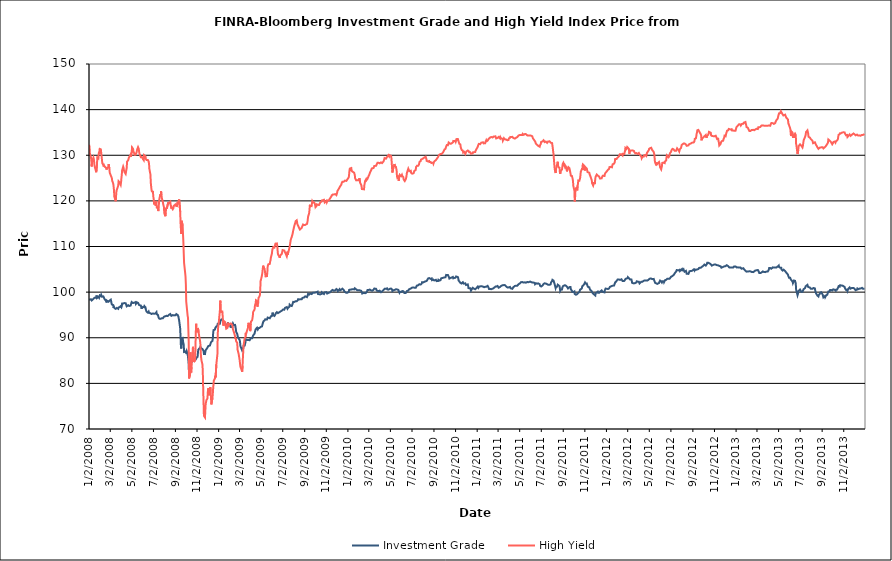
| Category | Investment Grade | High Yield |
|---|---|---|
| 1/2/08 | 98.337 | 132.293 |
| 1/3/08 | 98.358 | 131.799 |
| 1/4/08 | 98.524 | 130.434 |
| 1/7/08 | 98.436 | 129.561 |
| 1/8/08 | 98.305 | 128.956 |
| 1/9/08 | 98.174 | 127.53 |
| 1/10/08 | 98.058 | 128.298 |
| 1/11/08 | 98.376 | 128.78 |
| 1/14/08 | 98.517 | 129.494 |
| 1/15/08 | 98.694 | 129.211 |
| 1/16/08 | 98.695 | 128.559 |
| 1/17/08 | 98.751 | 127.724 |
| 1/18/08 | 98.633 | 127.936 |
| 1/22/08 | 98.77 | 126.27 |
| 1/23/08 | 99.273 | 126.228 |
| 1/24/08 | 98.707 | 127.975 |
| 1/25/08 | 98.86 | 129.489 |
| 1/28/08 | 98.969 | 129.313 |
| 1/29/08 | 98.823 | 130.425 |
| 1/30/08 | 98.743 | 130.71 |
| 1/31/08 | 99.005 | 130.356 |
| 2/1/08 | 99.286 | 131.379 |
| 2/4/08 | 99.139 | 131.284 |
| 2/5/08 | 99.394 | 130.53 |
| 2/6/08 | 99.316 | 129.842 |
| 2/7/08 | 98.995 | 129.054 |
| 2/8/08 | 98.938 | 128.292 |
| 2/11/08 | 99.055 | 127.834 |
| 2/12/08 | 98.842 | 127.526 |
| 2/13/08 | 98.759 | 127.812 |
| 2/14/08 | 98.506 | 128.015 |
| 2/15/08 | 98.48 | 127.496 |
| 2/19/08 | 98.065 | 127.216 |
| 2/20/08 | 97.734 | 126.86 |
| 2/21/08 | 98.151 | 127.118 |
| 2/22/08 | 98.308 | 127.087 |
| 2/25/08 | 97.881 | 127.442 |
| 2/26/08 | 97.785 | 128.038 |
| 2/27/08 | 97.922 | 127.971 |
| 2/28/08 | 98.104 | 127.117 |
| 2/29/08 | 98.304 | 126.172 |
| 3/3/08 | 98.352 | 125.588 |
| 3/4/08 | 98.01 | 125.372 |
| 3/5/08 | 97.579 | 125.599 |
| 3/6/08 | 97.296 | 124.984 |
| 3/7/08 | 97.268 | 124.421 |
| 3/10/08 | 97.154 | 123.76 |
| 3/11/08 | 96.527 | 123.134 |
| 3/12/08 | 96.766 | 122.372 |
| 3/13/08 | 96.631 | 120.939 |
| 3/14/08 | 96.461 | 120.942 |
| 3/17/08 | 96.334 | 119.921 |
| 3/18/08 | 96.297 | 121.114 |
| 3/19/08 | 96.436 | 122.177 |
| 3/20/08 | 96.528 | 122.053 |
| 3/24/08 | 96.345 | 123.33 |
| 3/25/08 | 96.627 | 124.299 |
| 3/26/08 | 96.718 | 124.484 |
| 3/27/08 | 96.626 | 124.415 |
| 3/28/08 | 96.725 | 124.025 |
| 3/31/08 | 96.93 | 123.51 |
| 4/1/08 | 96.733 | 124.086 |
| 4/2/08 | 96.681 | 124.971 |
| 4/3/08 | 96.904 | 125.651 |
| 4/4/08 | 97.511 | 126.698 |
| 4/7/08 | 97.51 | 127.501 |
| 4/8/08 | 97.52 | 127.264 |
| 4/9/08 | 97.663 | 126.784 |
| 4/10/08 | 97.601 | 126.514 |
| 4/11/08 | 97.682 | 126.279 |
| 4/14/08 | 97.563 | 125.906 |
| 4/15/08 | 97.328 | 126.02 |
| 4/16/08 | 97.135 | 126.838 |
| 4/17/08 | 96.893 | 127.234 |
| 4/18/08 | 96.825 | 128.596 |
| 4/21/08 | 97.135 | 128.905 |
| 4/22/08 | 97.274 | 129.136 |
| 4/23/08 | 97.26 | 129.434 |
| 4/24/08 | 96.953 | 129.446 |
| 4/25/08 | 96.919 | 129.6 |
| 4/28/08 | 97.06 | 130.166 |
| 4/29/08 | 97.332 | 129.693 |
| 4/30/08 | 97.527 | 130.093 |
| 5/1/08 | 97.824 | 130.518 |
| 5/2/08 | 97.661 | 131.72 |
| 5/5/08 | 97.608 | 131.372 |
| 5/6/08 | 97.515 | 130.782 |
| 5/7/08 | 97.444 | 130.624 |
| 5/8/08 | 97.675 | 130.508 |
| 5/9/08 | 97.876 | 130.119 |
| 5/12/08 | 97.82 | 130.1 |
| 5/13/08 | 97.428 | 130.119 |
| 5/14/08 | 97.243 | 130.183 |
| 5/15/08 | 97.393 | 130.66 |
| 5/16/08 | 97.747 | 131.142 |
| 5/19/08 | 97.633 | 131.778 |
| 5/20/08 | 97.729 | 131.603 |
| 5/21/08 | 97.645 | 131.401 |
| 5/22/08 | 97.16 | 130.774 |
| 5/23/08 | 97.326 | 130.321 |
| 5/27/08 | 97.058 | 129.562 |
| 5/28/08 | 96.717 | 129.577 |
| 5/29/08 | 96.344 | 129.674 |
| 5/30/08 | 96.618 | 129.614 |
| 6/2/08 | 96.776 | 129.144 |
| 6/3/08 | 96.823 | 128.928 |
| 6/4/08 | 96.966 | 128.918 |
| 6/5/08 | 96.689 | 130.034 |
| 6/6/08 | 96.934 | 129.935 |
| 6/9/08 | 96.667 | 129.754 |
| 6/10/08 | 96.181 | 129.199 |
| 6/11/08 | 96.106 | 129.031 |
| 6/12/08 | 95.726 | 128.947 |
| 6/13/08 | 95.637 | 128.871 |
| 6/16/08 | 95.49 | 128.941 |
| 6/17/08 | 95.599 | 129.027 |
| 6/18/08 | 95.735 | 128.631 |
| 6/19/08 | 95.5 | 128.104 |
| 6/20/08 | 95.542 | 126.99 |
| 6/23/08 | 95.361 | 125.756 |
| 6/24/08 | 95.322 | 123.938 |
| 6/25/08 | 95.234 | 123.849 |
| 6/26/08 | 95.211 | 122.417 |
| 6/27/08 | 95.37 | 122.083 |
| 6/30/08 | 95.326 | 122.015 |
| 7/1/08 | 95.242 | 120.994 |
| 7/2/08 | 95.291 | 120.494 |
| 7/3/08 | 95.268 | 119.376 |
| 7/7/08 | 95.303 | 119.338 |
| 7/8/08 | 95.38 | 118.894 |
| 7/9/08 | 95.507 | 119.988 |
| 7/10/08 | 95.61 | 119.526 |
| 7/11/08 | 95.133 | 118.545 |
| 7/14/08 | 95.026 | 118.598 |
| 7/15/08 | 94.85 | 117.763 |
| 7/16/08 | 94.424 | 118.204 |
| 7/17/08 | 94.351 | 119.458 |
| 7/18/08 | 94.184 | 120.377 |
| 7/21/08 | 94.134 | 121.405 |
| 7/22/08 | 94.028 | 121.027 |
| 7/23/08 | 93.974 | 122.089 |
| 7/24/08 | 94.249 | 121.386 |
| 7/25/08 | 94.186 | 120.7 |
| 7/28/08 | 94.249 | 119.757 |
| 7/29/08 | 94.107 | 119.308 |
| 7/30/08 | 94.178 | 119.38 |
| 7/31/08 | 94.599 | 118.67 |
| 8/1/08 | 94.699 | 117.364 |
| 8/4/08 | 94.713 | 116.635 |
| 8/5/08 | 94.657 | 117.239 |
| 8/6/08 | 94.53 | 118.192 |
| 8/7/08 | 94.807 | 118.517 |
| 8/8/08 | 94.93 | 118.252 |
| 8/11/08 | 94.769 | 119.285 |
| 8/12/08 | 94.943 | 119.703 |
| 8/13/08 | 94.87 | 119.454 |
| 8/14/08 | 95.006 | 119.25 |
| 8/15/08 | 95.131 | 119.665 |
| 8/18/08 | 95.209 | 119.835 |
| 8/19/08 | 95.043 | 119.116 |
| 8/20/08 | 95.044 | 118.825 |
| 8/21/08 | 94.799 | 118.314 |
| 8/22/08 | 94.815 | 118.599 |
| 8/25/08 | 94.961 | 118.172 |
| 8/26/08 | 94.886 | 118.211 |
| 8/27/08 | 94.867 | 118.44 |
| 8/28/08 | 94.901 | 118.928 |
| 8/29/08 | 94.868 | 119 |
| 9/2/08 | 94.919 | 119.25 |
| 9/3/08 | 95.106 | 119.097 |
| 9/4/08 | 95.186 | 118.982 |
| 9/5/08 | 95.219 | 118.666 |
| 9/8/08 | 94.978 | 119.742 |
| 9/9/08 | 95.027 | 119.424 |
| 9/10/08 | 94.622 | 119.247 |
| 9/11/08 | 94.194 | 119.234 |
| 9/12/08 | 93.81 | 120.298 |
| 9/15/08 | 92.025 | 117.633 |
| 9/16/08 | 90.092 | 115.19 |
| 9/17/08 | 88.23 | 113.908 |
| 9/18/08 | 87.636 | 112.743 |
| 9/19/08 | 89.872 | 115.631 |
| 9/22/08 | 89.965 | 114.566 |
| 9/23/08 | 89.22 | 112.575 |
| 9/24/08 | 89.05 | 110.96 |
| 9/25/08 | 88.426 | 108.539 |
| 9/26/08 | 86.89 | 106.375 |
| 9/29/08 | 86.977 | 104.222 |
| 9/30/08 | 86.876 | 103.43 |
| 10/1/08 | 86.751 | 101.71 |
| 10/2/08 | 86.819 | 97.935 |
| 10/3/08 | 87.149 | 97.823 |
| 10/6/08 | 86.436 | 94.808 |
| 10/7/08 | 86.246 | 94.401 |
| 10/8/08 | 85.143 | 91.924 |
| 10/9/08 | 84.134 | 89.213 |
| 10/10/08 | 81.864 | 81.076 |
| 10/13/08 | 83.272 | 81.975 |
| 10/14/08 | 85.255 | 86.794 |
| 10/15/08 | 84.925 | 83.898 |
| 10/16/08 | 84.641 | 82.379 |
| 10/17/08 | 84.539 | 83.665 |
| 10/20/08 | 84.815 | 86.874 |
| 10/21/08 | 85.391 | 88.018 |
| 10/22/08 | 85.605 | 87.498 |
| 10/23/08 | 85.546 | 86.721 |
| 10/24/08 | 85.063 | 84.67 |
| 10/27/08 | 85.091 | 85.116 |
| 10/28/08 | 85.016 | 87.267 |
| 10/29/08 | 85.168 | 91.03 |
| 10/30/08 | 85.38 | 93.07 |
| 10/31/08 | 85.678 | 91.342 |
| 11/3/08 | 85.804 | 91.332 |
| 11/4/08 | 86.602 | 92.14 |
| 11/5/08 | 87.387 | 91.979 |
| 11/6/08 | 87.457 | 91.266 |
| 11/7/08 | 87.4 | 90.623 |
| 11/10/08 | 87.789 | 89.341 |
| 11/11/08 | 88.014 | 88.614 |
| 11/12/08 | 87.806 | 86.758 |
| 11/13/08 | 87.683 | 85.686 |
| 11/14/08 | 87.742 | 85.064 |
| 11/17/08 | 87.536 | 84.062 |
| 11/18/08 | 87.622 | 81.922 |
| 11/19/08 | 87.483 | 78.459 |
| 11/20/08 | 87.102 | 75.704 |
| 11/21/08 | 86.436 | 72.878 |
| 11/24/08 | 86.419 | 72.527 |
| 11/25/08 | 86.942 | 74.185 |
| 11/26/08 | 87.278 | 75.528 |
| 11/28/08 | 87.428 | 76.308 |
| 12/1/08 | 87.818 | 76.725 |
| 12/2/08 | 87.828 | 78.06 |
| 12/3/08 | 88.165 | 78.943 |
| 12/4/08 | 88.276 | 78.616 |
| 12/5/08 | 88.352 | 77.394 |
| 12/8/08 | 88.3 | 78.751 |
| 12/9/08 | 88.55 | 79.2 |
| 12/10/08 | 88.79 | 78.471 |
| 12/11/08 | 89.027 | 76.734 |
| 12/12/08 | 89 | 75.396 |
| 12/15/08 | 89.304 | 76.795 |
| 12/16/08 | 89.82 | 77.573 |
| 12/17/08 | 90.915 | 78.849 |
| 12/18/08 | 91.664 | 79.826 |
| 12/19/08 | 91.687 | 80.639 |
| 12/22/08 | 91.794 | 81.058 |
| 12/23/08 | 92.121 | 81.683 |
| 12/24/08 | 92.293 | 81.31 |
| 12/26/08 | 92.468 | 84.136 |
| 12/29/08 | 92.639 | 86.354 |
| 12/30/08 | 93.049 | 90.684 |
| 12/31/08 | 93.073 | 92.13 |
| 1/2/09 | 93.046 | 93.384 |
| 1/5/09 | 93.049 | 95.884 |
| 1/6/09 | 93.475 | 98.139 |
| 1/7/09 | 93.709 | 97.71 |
| 1/8/09 | 93.718 | 95.533 |
| 1/9/09 | 93.985 | 95.816 |
| 1/12/09 | 94.097 | 95.762 |
| 1/13/09 | 93.983 | 94.686 |
| 1/14/09 | 93.92 | 93.286 |
| 1/15/09 | 93.546 | 92.655 |
| 1/16/09 | 93.671 | 93.669 |
| 1/20/09 | 93.14 | 93.418 |
| 1/21/09 | 92.925 | 93.023 |
| 1/22/09 | 92.583 | 92.395 |
| 1/23/09 | 92.491 | 91.995 |
| 1/26/09 | 92.535 | 92.134 |
| 1/27/09 | 92.931 | 92.144 |
| 1/28/09 | 93.364 | 93.304 |
| 1/29/09 | 93.001 | 93.191 |
| 1/30/09 | 92.791 | 92.696 |
| 2/2/09 | 92.882 | 92.996 |
| 2/3/09 | 92.637 | 92.918 |
| 2/4/09 | 92.379 | 93.053 |
| 2/5/09 | 92.294 | 93.127 |
| 2/6/09 | 92.318 | 93.083 |
| 2/9/09 | 92.344 | 92.836 |
| 2/10/09 | 92.826 | 92.698 |
| 2/11/09 | 93.112 | 91.824 |
| 2/12/09 | 93.017 | 91.606 |
| 2/13/09 | 92.764 | 91.393 |
| 2/17/09 | 92.806 | 90.299 |
| 2/18/09 | 92.404 | 89.67 |
| 2/19/09 | 91.948 | 89.9 |
| 2/20/09 | 91.302 | 89.233 |
| 2/23/09 | 90.863 | 88.885 |
| 2/24/09 | 90.44 | 87.376 |
| 2/25/09 | 90.154 | 87.339 |
| 2/26/09 | 89.975 | 87.524 |
| 2/27/09 | 89.852 | 86.478 |
| 3/2/09 | 89.476 | 85.02 |
| 3/3/09 | 89.055 | 84.259 |
| 3/4/09 | 88.198 | 83.636 |
| 3/5/09 | 87.979 | 83.569 |
| 3/6/09 | 87.845 | 83.252 |
| 3/9/09 | 87.196 | 82.542 |
| 3/10/09 | 87.218 | 83.855 |
| 3/11/09 | 87.46 | 85.554 |
| 3/12/09 | 87.764 | 87.06 |
| 3/13/09 | 88.258 | 88.329 |
| 3/16/09 | 88.272 | 89.854 |
| 3/17/09 | 88.372 | 89.896 |
| 3/18/09 | 88.919 | 90.118 |
| 3/19/09 | 89.64 | 91.095 |
| 3/20/09 | 89.443 | 90.814 |
| 3/23/09 | 89.512 | 91.642 |
| 3/24/09 | 89.466 | 91.703 |
| 3/25/09 | 89.433 | 92.049 |
| 3/26/09 | 89.521 | 92.951 |
| 3/27/09 | 89.705 | 93.274 |
| 3/30/09 | 89.455 | 92.469 |
| 3/31/09 | 89.615 | 92.327 |
| 4/1/09 | 89.672 | 91.447 |
| 4/2/09 | 89.883 | 93.017 |
| 4/3/09 | 89.748 | 93.575 |
| 4/6/09 | 89.88 | 93.801 |
| 4/7/09 | 89.967 | 94.252 |
| 4/8/09 | 90.298 | 94.749 |
| 4/9/09 | 90.527 | 95.685 |
| 4/13/09 | 90.891 | 96.175 |
| 4/14/09 | 91.268 | 97.038 |
| 4/15/09 | 91.545 | 96.985 |
| 4/16/09 | 91.842 | 97.579 |
| 4/17/09 | 92.015 | 98.223 |
| 4/20/09 | 92.183 | 98.037 |
| 4/21/09 | 92.024 | 96.806 |
| 4/22/09 | 91.82 | 97.228 |
| 4/23/09 | 91.922 | 97.456 |
| 4/24/09 | 92.114 | 98.694 |
| 4/27/09 | 92.136 | 99.12 |
| 4/28/09 | 92.124 | 99.355 |
| 4/29/09 | 92.267 | 100.493 |
| 4/30/09 | 92.365 | 102.465 |
| 5/1/09 | 92.375 | 102.702 |
| 5/4/09 | 92.495 | 103.726 |
| 5/5/09 | 92.789 | 104.282 |
| 5/6/09 | 93.129 | 105.004 |
| 5/7/09 | 93.372 | 105.794 |
| 5/8/09 | 93.6 | 105.722 |
| 5/11/09 | 93.779 | 105.05 |
| 5/12/09 | 93.96 | 104.733 |
| 5/13/09 | 94.041 | 104.064 |
| 5/14/09 | 93.916 | 103.447 |
| 5/15/09 | 94.086 | 103.407 |
| 5/18/09 | 94 | 103.509 |
| 5/19/09 | 94.058 | 104.332 |
| 5/20/09 | 94.43 | 105.679 |
| 5/21/09 | 94.416 | 105.772 |
| 5/22/09 | 94.366 | 106.114 |
| 5/26/09 | 94.273 | 106.193 |
| 5/27/09 | 94.248 | 106.702 |
| 5/28/09 | 94.182 | 106.98 |
| 5/29/09 | 94.698 | 107.538 |
| 6/1/09 | 94.766 | 108.487 |
| 6/2/09 | 95.131 | 109.26 |
| 6/3/09 | 95.498 | 109.24 |
| 6/4/09 | 95.301 | 109.279 |
| 6/5/09 | 94.935 | 109.888 |
| 6/8/09 | 94.77 | 109.759 |
| 6/9/09 | 94.929 | 109.861 |
| 6/10/09 | 94.939 | 110.333 |
| 6/11/09 | 95.142 | 110.634 |
| 6/12/09 | 95.402 | 110.815 |
| 6/15/09 | 95.623 | 110.676 |
| 6/16/09 | 95.67 | 110.228 |
| 6/17/09 | 95.691 | 109.146 |
| 6/18/09 | 95.399 | 108.309 |
| 6/19/09 | 95.443 | 108.448 |
| 6/22/09 | 95.594 | 107.775 |
| 6/23/09 | 95.659 | 107.525 |
| 6/24/09 | 95.636 | 107.874 |
| 6/25/09 | 95.746 | 107.911 |
| 6/26/09 | 95.946 | 108.186 |
| 6/29/09 | 95.945 | 108.376 |
| 6/30/09 | 95.921 | 108.789 |
| 7/1/09 | 96.003 | 109.206 |
| 7/2/09 | 96.182 | 109.406 |
| 7/6/09 | 96.153 | 109.117 |
| 7/7/09 | 96.272 | 109.134 |
| 7/8/09 | 96.542 | 108.697 |
| 7/9/09 | 96.516 | 108.509 |
| 7/10/09 | 96.67 | 108.411 |
| 7/13/09 | 96.732 | 107.832 |
| 7/14/09 | 96.599 | 108.205 |
| 7/15/09 | 96.363 | 108.875 |
| 7/16/09 | 96.563 | 108.21 |
| 7/17/09 | 96.594 | 108.698 |
| 7/20/09 | 96.772 | 109.528 |
| 7/21/09 | 97.252 | 109.932 |
| 7/22/09 | 97.248 | 109.982 |
| 7/23/09 | 97.034 | 110.913 |
| 7/24/09 | 96.997 | 111.456 |
| 7/27/09 | 96.955 | 112.11 |
| 7/28/09 | 97.153 | 112.406 |
| 7/29/09 | 97.334 | 112.65 |
| 7/30/09 | 97.408 | 113.036 |
| 7/31/09 | 97.86 | 113.46 |
| 8/3/09 | 97.829 | 114.476 |
| 8/4/09 | 97.856 | 114.731 |
| 8/5/09 | 97.963 | 114.79 |
| 8/6/09 | 97.987 | 115.221 |
| 8/7/09 | 97.828 | 115.565 |
| 8/10/09 | 98.002 | 115.741 |
| 8/11/09 | 98.141 | 115.533 |
| 8/12/09 | 97.986 | 114.874 |
| 8/13/09 | 98.218 | 114.945 |
| 8/14/09 | 98.442 | 114.835 |
| 8/17/09 | 98.39 | 114.028 |
| 8/18/09 | 98.4 | 114.038 |
| 8/19/09 | 98.41 | 113.726 |
| 8/20/09 | 98.446 | 113.881 |
| 8/21/09 | 98.305 | 113.895 |
| 8/24/09 | 98.431 | 114.076 |
| 8/25/09 | 98.596 | 114.251 |
| 8/26/09 | 98.732 | 114.472 |
| 8/27/09 | 98.695 | 114.602 |
| 8/28/09 | 98.743 | 114.82 |
| 8/31/09 | 98.832 | 114.697 |
| 9/1/09 | 98.91 | 114.882 |
| 9/2/09 | 99.024 | 114.76 |
| 9/3/09 | 99.086 | 114.735 |
| 9/4/09 | 99.037 | 114.949 |
| 9/8/09 | 98.902 | 114.966 |
| 9/9/09 | 98.868 | 115.29 |
| 9/10/09 | 99.275 | 115.746 |
| 9/11/09 | 99.63 | 116.507 |
| 9/14/09 | 99.465 | 117.283 |
| 9/15/09 | 99.509 | 117.986 |
| 9/16/09 | 99.637 | 118.978 |
| 9/17/09 | 99.682 | 118.863 |
| 9/18/09 | 99.677 | 118.972 |
| 9/21/09 | 99.578 | 118.867 |
| 9/22/09 | 99.615 | 119.476 |
| 9/23/09 | 99.677 | 119.925 |
| 9/24/09 | 99.835 | 119.779 |
| 9/25/09 | 99.768 | 119.622 |
| 9/28/09 | 99.868 | 119.663 |
| 9/29/09 | 99.826 | 119.763 |
| 9/30/09 | 99.757 | 119.41 |
| 10/1/09 | 99.904 | 119.082 |
| 10/2/09 | 99.914 | 118.616 |
| 10/5/09 | 99.98 | 118.885 |
| 10/6/09 | 99.975 | 119.229 |
| 10/7/09 | 100.087 | 119.03 |
| 10/8/09 | 100.089 | 119.186 |
| 10/9/09 | 99.596 | 119.138 |
| 10/12/09 | 99.549 | 119.102 |
| 10/13/09 | 99.766 | 119.083 |
| 10/14/09 | 99.64 | 119.441 |
| 10/15/09 | 99.494 | 119.517 |
| 10/16/09 | 99.538 | 119.694 |
| 10/19/09 | 99.609 | 119.838 |
| 10/20/09 | 99.952 | 120.101 |
| 10/21/09 | 99.821 | 120.17 |
| 10/22/09 | 99.853 | 120.154 |
| 10/23/09 | 99.747 | 120.141 |
| 10/26/09 | 99.587 | 120.241 |
| 10/27/09 | 99.767 | 120.107 |
| 10/28/09 | 99.948 | 119.659 |
| 10/29/09 | 99.742 | 119.547 |
| 10/30/09 | 100 | 119.579 |
| 11/2/09 | 100.004 | 120.016 |
| 11/3/09 | 99.815 | 119.705 |
| 11/4/09 | 99.683 | 119.877 |
| 11/5/09 | 99.678 | 120.075 |
| 11/6/09 | 99.806 | 120.007 |
| 11/9/09 | 99.89 | 120.129 |
| 11/10/09 | 99.993 | 120.314 |
| 11/11/09 | 99.828 | 120.433 |
| 11/12/09 | 99.959 | 120.398 |
| 11/13/09 | 100.034 | 120.493 |
| 11/16/09 | 100.303 | 120.991 |
| 11/17/09 | 100.436 | 121.234 |
| 11/18/09 | 100.437 | 121.449 |
| 11/19/09 | 100.485 | 121.419 |
| 11/20/09 | 100.415 | 121.398 |
| 11/23/09 | 100.318 | 121.412 |
| 11/24/09 | 100.461 | 121.467 |
| 11/25/09 | 100.464 | 121.62 |
| 11/27/09 | 100.4 | 121.478 |
| 11/30/09 | 100.681 | 121.265 |
| 12/1/09 | 100.653 | 121.495 |
| 12/2/09 | 100.639 | 121.788 |
| 12/3/09 | 100.507 | 122.183 |
| 12/4/09 | 100.204 | 122.288 |
| 12/7/09 | 100.412 | 122.671 |
| 12/8/09 | 100.612 | 122.734 |
| 12/9/09 | 100.64 | 122.82 |
| 12/10/09 | 100.549 | 123.115 |
| 12/11/09 | 100.415 | 123.275 |
| 12/14/09 | 100.556 | 123.59 |
| 12/15/09 | 100.456 | 123.888 |
| 12/16/09 | 100.51 | 124.099 |
| 12/17/09 | 100.756 | 124.185 |
| 12/18/09 | 100.804 | 124.076 |
| 12/21/09 | 100.456 | 124.216 |
| 12/22/09 | 100.197 | 124.354 |
| 12/23/09 | 100.197 | 124.34 |
| 12/24/09 | 100.077 | 124.454 |
| 12/28/09 | 99.846 | 124.37 |
| 12/29/09 | 99.856 | 124.526 |
| 12/30/09 | 100.027 | 124.596 |
| 12/31/09 | 99.868 | 124.726 |
| 1/4/10 | 100.102 | 125.163 |
| 1/5/10 | 100.49 | 125.873 |
| 1/6/10 | 100.447 | 126.69 |
| 1/7/10 | 100.503 | 127.071 |
| 1/8/10 | 100.542 | 127.104 |
| 1/11/10 | 100.559 | 127.199 |
| 1/12/10 | 100.775 | 126.595 |
| 1/13/10 | 100.668 | 126.609 |
| 1/14/10 | 100.647 | 126.495 |
| 1/15/10 | 100.825 | 126.376 |
| 1/19/10 | 100.604 | 126.186 |
| 1/20/10 | 100.724 | 126.008 |
| 1/21/10 | 100.842 | 125.662 |
| 1/22/10 | 100.705 | 124.921 |
| 1/25/10 | 100.59 | 124.498 |
| 1/26/10 | 100.603 | 124.395 |
| 1/27/10 | 100.508 | 124.599 |
| 1/28/10 | 100.405 | 124.548 |
| 1/29/10 | 100.417 | 124.508 |
| 2/1/10 | 100.394 | 124.505 |
| 2/2/10 | 100.469 | 124.725 |
| 2/3/10 | 100.363 | 124.969 |
| 2/4/10 | 100.396 | 124.762 |
| 2/5/10 | 100.385 | 123.977 |
| 2/8/10 | 100.291 | 123.526 |
| 2/9/10 | 100.167 | 123.238 |
| 2/10/10 | 99.997 | 122.602 |
| 2/11/10 | 99.691 | 122.473 |
| 2/12/10 | 99.896 | 122.576 |
| 2/16/10 | 99.868 | 122.529 |
| 2/17/10 | 99.849 | 123.433 |
| 2/18/10 | 99.79 | 123.864 |
| 2/19/10 | 99.757 | 124.339 |
| 2/22/10 | 99.858 | 124.755 |
| 2/23/10 | 100.056 | 124.527 |
| 2/24/10 | 100.143 | 124.602 |
| 2/25/10 | 100.208 | 124.538 |
| 2/26/10 | 100.466 | 124.842 |
| 3/1/10 | 100.447 | 125.466 |
| 3/2/10 | 100.481 | 125.66 |
| 3/3/10 | 100.547 | 125.78 |
| 3/4/10 | 100.572 | 125.898 |
| 3/5/10 | 100.406 | 126.217 |
| 3/8/10 | 100.383 | 126.711 |
| 3/9/10 | 100.445 | 126.852 |
| 3/10/10 | 100.329 | 127.106 |
| 3/11/10 | 100.316 | 127.14 |
| 3/12/10 | 100.488 | 127.262 |
| 3/15/10 | 100.522 | 127.212 |
| 3/16/10 | 100.654 | 127.15 |
| 3/17/10 | 100.794 | 127.664 |
| 3/18/10 | 100.787 | 127.842 |
| 3/19/10 | 100.77 | 127.776 |
| 3/22/10 | 100.728 | 127.676 |
| 3/23/10 | 100.762 | 127.779 |
| 3/24/10 | 100.328 | 128.048 |
| 3/25/10 | 100.142 | 128.082 |
| 3/26/10 | 100.176 | 128.355 |
| 3/29/10 | 100.218 | 128.357 |
| 3/30/10 | 100.26 | 128.526 |
| 3/31/10 | 100.4 | 128.354 |
| 4/1/10 | 100.318 | 128.234 |
| 4/5/10 | 99.992 | 128.435 |
| 4/6/10 | 99.974 | 128.282 |
| 4/7/10 | 100.148 | 128.468 |
| 4/8/10 | 100.17 | 128.282 |
| 4/9/10 | 100.252 | 128.463 |
| 4/12/10 | 100.46 | 128.647 |
| 4/13/10 | 100.602 | 128.822 |
| 4/14/10 | 100.658 | 129.085 |
| 4/15/10 | 100.72 | 129.378 |
| 4/16/10 | 100.861 | 129.541 |
| 4/19/10 | 100.72 | 129.254 |
| 4/20/10 | 100.713 | 129.364 |
| 4/21/10 | 100.841 | 129.516 |
| 4/22/10 | 100.818 | 129.413 |
| 4/23/10 | 100.588 | 129.707 |
| 4/26/10 | 100.539 | 130.023 |
| 4/27/10 | 100.749 | 129.974 |
| 4/28/10 | 100.637 | 129.76 |
| 4/29/10 | 100.695 | 130.026 |
| 4/30/10 | 100.908 | 129.932 |
| 5/3/10 | 100.788 | 129.878 |
| 5/4/10 | 100.905 | 129.637 |
| 5/5/10 | 100.862 | 128.685 |
| 5/6/10 | 100.609 | 127.446 |
| 5/7/10 | 100.233 | 126.211 |
| 5/10/10 | 100.404 | 127.273 |
| 5/11/10 | 100.358 | 127.056 |
| 5/12/10 | 100.306 | 127.684 |
| 5/13/10 | 100.48 | 128.088 |
| 5/14/10 | 100.68 | 127.605 |
| 5/17/10 | 100.617 | 127.473 |
| 5/18/10 | 100.721 | 127.395 |
| 5/19/10 | 100.652 | 126.706 |
| 5/20/10 | 100.6 | 125.442 |
| 5/21/10 | 100.415 | 125.086 |
| 5/24/10 | 100.481 | 125.319 |
| 5/25/10 | 100.136 | 124.396 |
| 5/26/10 | 100.104 | 124.91 |
| 5/27/10 | 99.874 | 125.323 |
| 5/28/10 | 100.099 | 125.704 |
| 6/1/10 | 100.03 | 125.412 |
| 6/2/10 | 99.906 | 125.392 |
| 6/3/10 | 99.946 | 125.704 |
| 6/4/10 | 100.231 | 125.471 |
| 6/7/10 | 100.206 | 125.2 |
| 6/8/10 | 100.11 | 124.677 |
| 6/9/10 | 100.083 | 124.67 |
| 6/10/10 | 99.801 | 124.634 |
| 6/11/10 | 99.808 | 124.35 |
| 6/14/10 | 99.829 | 124.765 |
| 6/15/10 | 99.86 | 125.1 |
| 6/16/10 | 99.92 | 125.477 |
| 6/17/10 | 100.239 | 126.08 |
| 6/18/10 | 100.29 | 126.379 |
| 6/21/10 | 100.344 | 127.069 |
| 6/22/10 | 100.487 | 126.885 |
| 6/23/10 | 100.61 | 126.856 |
| 6/24/10 | 100.569 | 126.505 |
| 6/25/10 | 100.558 | 126.6 |
| 6/28/10 | 100.784 | 126.599 |
| 6/29/10 | 100.881 | 126.131 |
| 6/30/10 | 100.978 | 126.332 |
| 7/1/10 | 100.965 | 125.953 |
| 7/2/10 | 100.974 | 125.967 |
| 7/6/10 | 101.028 | 126.06 |
| 7/7/10 | 100.928 | 126.207 |
| 7/8/10 | 100.951 | 126.563 |
| 7/9/10 | 100.945 | 126.756 |
| 7/12/10 | 100.939 | 126.793 |
| 7/13/10 | 100.992 | 127.434 |
| 7/14/10 | 100.998 | 127.449 |
| 7/15/10 | 101.414 | 127.578 |
| 7/16/10 | 101.574 | 127.717 |
| 7/19/10 | 101.508 | 127.688 |
| 7/20/10 | 101.593 | 127.776 |
| 7/21/10 | 101.672 | 127.949 |
| 7/22/10 | 101.721 | 128.3 |
| 7/23/10 | 101.691 | 128.582 |
| 7/26/10 | 101.665 | 128.726 |
| 7/27/10 | 101.716 | 129.049 |
| 7/28/10 | 101.723 | 129.168 |
| 7/29/10 | 101.885 | 128.993 |
| 7/30/10 | 102.177 | 129.176 |
| 8/2/10 | 102.135 | 129.303 |
| 8/3/10 | 102.299 | 129.487 |
| 8/4/10 | 102.207 | 129.465 |
| 8/5/10 | 102.25 | 129.5 |
| 8/6/10 | 102.431 | 129.631 |
| 8/9/10 | 102.373 | 129.675 |
| 8/10/10 | 102.438 | 129.445 |
| 8/11/10 | 102.495 | 129.168 |
| 8/12/10 | 102.453 | 128.755 |
| 8/13/10 | 102.521 | 128.568 |
| 8/16/10 | 102.995 | 128.643 |
| 8/17/10 | 102.924 | 128.731 |
| 8/18/10 | 102.975 | 128.831 |
| 8/19/10 | 103.087 | 128.733 |
| 8/20/10 | 102.992 | 128.508 |
| 8/23/10 | 102.902 | 128.534 |
| 8/24/10 | 103.11 | 128.37 |
| 8/25/10 | 103.069 | 128.303 |
| 8/26/10 | 103.004 | 128.195 |
| 8/27/10 | 102.638 | 128.262 |
| 8/30/10 | 102.77 | 128.382 |
| 8/31/10 | 102.91 | 128.147 |
| 9/1/10 | 102.667 | 128.36 |
| 9/2/10 | 102.558 | 128.62 |
| 9/3/10 | 102.437 | 128.836 |
| 9/7/10 | 102.695 | 128.945 |
| 9/8/10 | 102.694 | 128.974 |
| 9/9/10 | 102.414 | 129.155 |
| 9/10/10 | 102.242 | 129.258 |
| 9/13/10 | 102.438 | 129.602 |
| 9/14/10 | 102.704 | 129.521 |
| 9/15/10 | 102.649 | 129.674 |
| 9/16/10 | 102.499 | 130.074 |
| 9/17/10 | 102.528 | 130.135 |
| 9/20/10 | 102.632 | 130.295 |
| 9/21/10 | 102.768 | 130.466 |
| 9/22/10 | 103.038 | 130.485 |
| 9/23/10 | 103.079 | 130.298 |
| 9/24/10 | 102.892 | 130.335 |
| 9/27/10 | 103.136 | 130.598 |
| 9/28/10 | 103.196 | 130.688 |
| 9/29/10 | 103.217 | 130.894 |
| 9/30/10 | 103.213 | 131.102 |
| 10/1/10 | 103.293 | 131.255 |
| 10/4/10 | 103.25 | 131.415 |
| 10/5/10 | 103.36 | 131.667 |
| 10/6/10 | 103.777 | 131.956 |
| 10/7/10 | 103.821 | 132.099 |
| 10/8/10 | 103.882 | 132.244 |
| 10/11/10 | 103.749 | 132.212 |
| 10/12/10 | 103.668 | 132.314 |
| 10/13/10 | 103.535 | 132.793 |
| 10/14/10 | 103.235 | 132.644 |
| 10/15/10 | 102.972 | 132.584 |
| 10/18/10 | 103.11 | 132.508 |
| 10/19/10 | 103.211 | 132.456 |
| 10/20/10 | 103.237 | 132.329 |
| 10/21/10 | 103.168 | 132.579 |
| 10/22/10 | 103.146 | 132.563 |
| 10/25/10 | 103.321 | 132.824 |
| 10/26/10 | 103.025 | 133.129 |
| 10/27/10 | 102.808 | 133.066 |
| 10/28/10 | 102.914 | 133.18 |
| 10/29/10 | 103.11 | 133.087 |
| 11/1/10 | 103.142 | 133.192 |
| 11/2/10 | 103.332 | 132.962 |
| 11/3/10 | 103.438 | 133.19 |
| 11/4/10 | 103.58 | 133.536 |
| 11/5/10 | 103.406 | 133.536 |
| 11/8/10 | 103.31 | 133.557 |
| 11/9/10 | 103.055 | 133.593 |
| 11/10/10 | 102.564 | 133.022 |
| 11/11/10 | 102.616 | 132.97 |
| 11/12/10 | 102.468 | 132.524 |
| 11/15/10 | 102.045 | 132.371 |
| 11/16/10 | 101.932 | 131.763 |
| 11/17/10 | 102.112 | 131.511 |
| 11/18/10 | 101.897 | 131.639 |
| 11/19/10 | 102.054 | 131.122 |
| 11/22/10 | 102.165 | 131.019 |
| 11/23/10 | 102.278 | 130.588 |
| 11/24/10 | 101.864 | 130.542 |
| 11/26/10 | 101.863 | 130.744 |
| 11/29/10 | 101.922 | 130.291 |
| 11/30/10 | 102.022 | 130.145 |
| 12/1/10 | 101.568 | 130.481 |
| 12/2/10 | 101.476 | 130.838 |
| 12/3/10 | 101.519 | 130.961 |
| 12/6/10 | 101.694 | 131.045 |
| 12/7/10 | 101.352 | 131.156 |
| 12/8/10 | 100.876 | 130.842 |
| 12/9/10 | 100.991 | 130.879 |
| 12/10/10 | 100.934 | 130.643 |
| 12/13/10 | 100.857 | 130.642 |
| 12/14/10 | 100.596 | 130.565 |
| 12/15/10 | 100.33 | 130.335 |
| 12/16/10 | 100.307 | 130.398 |
| 12/17/10 | 100.602 | 130.396 |
| 12/20/10 | 100.943 | 130.42 |
| 12/21/10 | 100.841 | 130.656 |
| 12/22/10 | 100.868 | 130.633 |
| 12/23/10 | 100.766 | 130.815 |
| 12/27/10 | 100.627 | 130.708 |
| 12/28/10 | 100.526 | 130.99 |
| 12/29/10 | 100.688 | 131.074 |
| 12/30/10 | 100.846 | 131.261 |
| 12/31/10 | 101.042 | 131.455 |
| 1/3/11 | 101.208 | 131.858 |
| 1/4/11 | 101.316 | 132.091 |
| 1/5/11 | 100.937 | 132.302 |
| 1/6/11 | 100.955 | 132.482 |
| 1/7/11 | 101.214 | 132.404 |
| 1/10/11 | 101.247 | 132.434 |
| 1/11/11 | 101.24 | 132.58 |
| 1/12/11 | 101.18 | 132.636 |
| 1/13/11 | 101.307 | 132.753 |
| 1/14/11 | 101.392 | 132.788 |
| 1/18/11 | 101.21 | 132.849 |
| 1/19/11 | 101.349 | 132.835 |
| 1/20/11 | 101.094 | 132.594 |
| 1/21/11 | 101.074 | 132.574 |
| 1/24/11 | 101.163 | 132.632 |
| 1/25/11 | 101.328 | 132.944 |
| 1/26/11 | 101.147 | 133.021 |
| 1/27/11 | 101.186 | 133.283 |
| 1/28/11 | 101.332 | 133.054 |
| 1/31/11 | 101.371 | 133.197 |
| 2/1/11 | 101.177 | 133.376 |
| 2/2/11 | 101.113 | 133.508 |
| 2/3/11 | 100.901 | 133.416 |
| 2/4/11 | 100.688 | 133.653 |
| 2/7/11 | 100.708 | 133.883 |
| 2/8/11 | 100.678 | 134.026 |
| 2/9/11 | 100.64 | 134.065 |
| 2/10/11 | 100.635 | 134.006 |
| 2/11/11 | 100.689 | 133.906 |
| 2/14/11 | 100.76 | 133.89 |
| 2/15/11 | 100.792 | 133.913 |
| 2/16/11 | 100.816 | 134.016 |
| 2/17/11 | 100.877 | 134.107 |
| 2/18/11 | 100.849 | 134.178 |
| 2/22/11 | 101.209 | 134.145 |
| 2/23/11 | 101.204 | 133.96 |
| 2/24/11 | 101.068 | 133.689 |
| 2/25/11 | 101.217 | 133.737 |
| 2/28/11 | 101.347 | 133.797 |
| 3/1/11 | 101.398 | 133.935 |
| 3/2/11 | 101.379 | 133.992 |
| 3/3/11 | 100.969 | 134.003 |
| 3/4/11 | 101.076 | 133.893 |
| 3/7/11 | 101.137 | 133.668 |
| 3/8/11 | 101.019 | 133.964 |
| 3/9/11 | 101.172 | 133.956 |
| 3/10/11 | 101.344 | 133.656 |
| 3/11/11 | 101.44 | 133.576 |
| 3/14/11 | 101.514 | 133.638 |
| 3/15/11 | 101.535 | 133.214 |
| 3/16/11 | 101.719 | 133.178 |
| 3/17/11 | 101.535 | 133.421 |
| 3/18/11 | 101.606 | 133.749 |
| 3/21/11 | 101.533 | 133.484 |
| 3/22/11 | 101.512 | 133.544 |
| 3/23/11 | 101.421 | 133.408 |
| 3/24/11 | 101.267 | 133.44 |
| 3/25/11 | 101.138 | 133.353 |
| 3/28/11 | 101.016 | 133.284 |
| 3/29/11 | 100.882 | 133.292 |
| 3/30/11 | 100.871 | 133.463 |
| 3/31/11 | 101.038 | 133.352 |
| 4/1/11 | 100.887 | 133.702 |
| 4/4/11 | 101.136 | 133.797 |
| 4/5/11 | 100.963 | 134.02 |
| 4/6/11 | 100.836 | 133.92 |
| 4/7/11 | 100.781 | 133.902 |
| 4/8/11 | 100.76 | 134.004 |
| 4/11/11 | 100.727 | 134.028 |
| 4/12/11 | 100.924 | 133.848 |
| 4/13/11 | 101.032 | 133.808 |
| 4/14/11 | 101.001 | 133.714 |
| 4/15/11 | 101.239 | 133.871 |
| 4/18/11 | 101.36 | 133.65 |
| 4/19/11 | 101.451 | 133.651 |
| 4/20/11 | 101.424 | 133.737 |
| 4/21/11 | 101.387 | 133.825 |
| 4/25/11 | 101.419 | 133.988 |
| 4/26/11 | 101.611 | 134.092 |
| 4/27/11 | 101.48 | 134.04 |
| 4/28/11 | 101.708 | 134.311 |
| 4/29/11 | 101.828 | 134.333 |
| 5/2/11 | 101.906 | 134.443 |
| 5/3/11 | 101.997 | 134.32 |
| 5/4/11 | 102.075 | 134.479 |
| 5/5/11 | 102.171 | 134.418 |
| 5/6/11 | 102.158 | 134.578 |
| 5/9/11 | 102.209 | 134.425 |
| 5/10/11 | 102.082 | 134.688 |
| 5/11/11 | 102.109 | 134.7 |
| 5/12/11 | 102.099 | 134.527 |
| 5/13/11 | 102.138 | 134.491 |
| 5/16/11 | 102.149 | 134.632 |
| 5/17/11 | 102.353 | 134.587 |
| 5/18/11 | 102.212 | 134.566 |
| 5/19/11 | 102.07 | 134.636 |
| 5/20/11 | 102.132 | 134.542 |
| 5/23/11 | 102.226 | 134.352 |
| 5/24/11 | 102.138 | 134.411 |
| 5/25/11 | 102.088 | 134.326 |
| 5/26/11 | 102.164 | 134.342 |
| 5/27/11 | 102.195 | 134.51 |
| 5/31/11 | 102.313 | 134.338 |
| 6/1/11 | 102.499 | 134.385 |
| 6/2/11 | 102.253 | 134.221 |
| 6/3/11 | 102.189 | 134.283 |
| 6/6/11 | 102.12 | 134.159 |
| 6/7/11 | 102.072 | 133.967 |
| 6/8/11 | 102.173 | 133.704 |
| 6/9/11 | 102.106 | 133.568 |
| 6/10/11 | 102.076 | 133.506 |
| 6/13/11 | 102.012 | 133.153 |
| 6/14/11 | 101.73 | 133.037 |
| 6/15/11 | 101.868 | 132.872 |
| 6/16/11 | 101.948 | 132.554 |
| 6/17/11 | 101.926 | 132.653 |
| 6/20/11 | 101.853 | 132.269 |
| 6/21/11 | 101.876 | 132.267 |
| 6/22/11 | 101.873 | 132.44 |
| 6/23/11 | 101.908 | 132.05 |
| 6/24/11 | 102.002 | 132.113 |
| 6/27/11 | 101.741 | 131.865 |
| 6/28/11 | 101.402 | 132.191 |
| 6/29/11 | 101.26 | 132.363 |
| 6/30/11 | 101.2 | 132.454 |
| 7/1/11 | 101.237 | 132.902 |
| 7/5/11 | 101.449 | 133.029 |
| 7/6/11 | 101.506 | 133.115 |
| 7/7/11 | 101.395 | 133.231 |
| 7/8/11 | 101.8 | 133.28 |
| 7/11/11 | 101.933 | 132.888 |
| 7/12/11 | 102.014 | 132.784 |
| 7/13/11 | 102.042 | 132.957 |
| 7/14/11 | 101.89 | 132.999 |
| 7/15/11 | 101.851 | 132.866 |
| 7/18/11 | 101.732 | 132.724 |
| 7/19/11 | 101.677 | 132.722 |
| 7/20/11 | 101.802 | 132.936 |
| 7/21/11 | 101.598 | 133.028 |
| 7/22/11 | 101.707 | 133.068 |
| 7/25/11 | 101.6 | 133.049 |
| 7/26/11 | 101.668 | 133.246 |
| 7/27/11 | 101.671 | 132.951 |
| 7/28/11 | 101.71 | 132.748 |
| 7/29/11 | 102.101 | 132.541 |
| 8/1/11 | 102.445 | 132.668 |
| 8/2/11 | 102.69 | 132.126 |
| 8/3/11 | 102.765 | 131.582 |
| 8/4/11 | 102.858 | 130.856 |
| 8/5/11 | 102.526 | 130.297 |
| 8/8/11 | 101.818 | 127.319 |
| 8/9/11 | 101.642 | 126.715 |
| 8/10/11 | 101.666 | 126.678 |
| 8/11/11 | 100.881 | 126.106 |
| 8/12/11 | 101.126 | 127.015 |
| 8/15/11 | 101.191 | 127.903 |
| 8/16/11 | 101.405 | 128.042 |
| 8/17/11 | 101.631 | 128.573 |
| 8/18/11 | 101.692 | 127.705 |
| 8/19/11 | 101.529 | 127.395 |
| 8/22/11 | 101.314 | 127.264 |
| 8/23/11 | 100.821 | 126.282 |
| 8/24/11 | 100.273 | 125.927 |
| 8/25/11 | 100.448 | 126.498 |
| 8/26/11 | 100.592 | 126.715 |
| 8/29/11 | 100.573 | 126.885 |
| 8/30/11 | 101.003 | 127.033 |
| 8/31/11 | 101.14 | 128.078 |
| 9/1/11 | 101.324 | 128.205 |
| 9/2/11 | 101.474 | 128.365 |
| 9/6/11 | 101.516 | 127.515 |
| 9/7/11 | 101.486 | 127.765 |
| 9/8/11 | 101.502 | 127.727 |
| 9/9/11 | 101.426 | 127.519 |
| 9/12/11 | 101.178 | 126.474 |
| 9/13/11 | 100.959 | 126.623 |
| 9/14/11 | 100.983 | 127.097 |
| 9/15/11 | 100.799 | 127.314 |
| 9/16/11 | 100.88 | 127.409 |
| 9/19/11 | 101.097 | 127.172 |
| 9/20/11 | 101.095 | 127.29 |
| 9/21/11 | 101.153 | 127.116 |
| 9/22/11 | 101.108 | 125.995 |
| 9/23/11 | 100.647 | 125.52 |
| 9/26/11 | 100.298 | 125.465 |
| 9/27/11 | 100.058 | 125.611 |
| 9/28/11 | 99.924 | 124.851 |
| 9/29/11 | 99.972 | 124.344 |
| 9/30/11 | 99.996 | 123.273 |
| 10/3/11 | 100.148 | 122.236 |
| 10/4/11 | 99.594 | 119.881 |
| 10/5/11 | 99.418 | 120.775 |
| 10/6/11 | 99.443 | 122.277 |
| 10/7/11 | 99.434 | 122.768 |
| 10/10/11 | 99.517 | 122.852 |
| 10/11/11 | 99.353 | 122.3 |
| 10/12/11 | 99.527 | 123.376 |
| 10/13/11 | 99.78 | 123.672 |
| 10/14/11 | 99.81 | 124.466 |
| 10/17/11 | 100.031 | 124.417 |
| 10/18/11 | 100.25 | 124.296 |
| 10/19/11 | 100.53 | 124.939 |
| 10/20/11 | 100.68 | 125.541 |
| 10/21/11 | 100.707 | 126.394 |
| 10/24/11 | 100.807 | 126.914 |
| 10/25/11 | 101.264 | 127.167 |
| 10/26/11 | 101.368 | 126.792 |
| 10/27/11 | 101.348 | 127.975 |
| 10/28/11 | 101.463 | 127.875 |
| 10/31/11 | 101.784 | 127.696 |
| 11/1/11 | 101.959 | 126.648 |
| 11/2/11 | 102.125 | 126.978 |
| 11/3/11 | 102.008 | 127.376 |
| 11/4/11 | 101.874 | 127.162 |
| 11/7/11 | 101.905 | 127.097 |
| 11/8/11 | 101.595 | 127.239 |
| 11/9/11 | 101.39 | 126.322 |
| 11/10/11 | 101.173 | 126.414 |
| 11/11/11 | 101.238 | 126.491 |
| 11/14/11 | 101.069 | 126.17 |
| 11/15/11 | 100.767 | 125.82 |
| 11/16/11 | 100.761 | 125.629 |
| 11/17/11 | 100.469 | 125.434 |
| 11/18/11 | 100.413 | 125.196 |
| 11/21/11 | 100.183 | 124.532 |
| 11/22/11 | 99.951 | 123.879 |
| 11/23/11 | 99.805 | 123.809 |
| 11/25/11 | 99.664 | 123.358 |
| 11/28/11 | 99.47 | 124.094 |
| 11/29/11 | 99.414 | 123.689 |
| 11/30/11 | 99.404 | 124.084 |
| 12/1/11 | 99.27 | 124.86 |
| 12/2/11 | 99.785 | 125.29 |
| 12/5/11 | 99.93 | 125.775 |
| 12/6/11 | 99.982 | 125.795 |
| 12/7/11 | 99.949 | 125.612 |
| 12/8/11 | 100.115 | 125.538 |
| 12/9/11 | 99.872 | 125.454 |
| 12/12/11 | 99.867 | 125.317 |
| 12/13/11 | 99.906 | 125.158 |
| 12/14/11 | 100 | 124.913 |
| 12/15/11 | 100.134 | 124.961 |
| 12/16/11 | 100.313 | 125.058 |
| 12/19/11 | 100.375 | 124.938 |
| 12/20/11 | 100.196 | 125.175 |
| 12/21/11 | 100.097 | 125.223 |
| 12/22/11 | 100.134 | 125.503 |
| 12/23/11 | 100.016 | 125.63 |
| 12/27/11 | 99.947 | 125.464 |
| 12/28/11 | 100.421 | 125.864 |
| 12/29/11 | 100.555 | 126.044 |
| 12/30/11 | 100.774 | 126.162 |
| 1/3/12 | 100.742 | 126.521 |
| 1/4/12 | 100.597 | 126.529 |
| 1/5/12 | 100.548 | 126.663 |
| 1/6/12 | 100.672 | 126.824 |
| 1/9/12 | 100.818 | 127.016 |
| 1/10/12 | 100.91 | 127.393 |
| 1/11/12 | 101.119 | 127.414 |
| 1/12/12 | 101.246 | 127.571 |
| 1/13/12 | 101.324 | 127.463 |
| 1/17/12 | 101.365 | 127.36 |
| 1/18/12 | 101.455 | 127.435 |
| 1/19/12 | 101.448 | 128.026 |
| 1/20/12 | 101.421 | 128.07 |
| 1/23/12 | 101.433 | 128.175 |
| 1/24/12 | 101.349 | 128.221 |
| 1/25/12 | 101.65 | 128.487 |
| 1/26/12 | 102.102 | 129.167 |
| 1/27/12 | 102.266 | 129.213 |
| 1/30/12 | 102.431 | 129.164 |
| 1/31/12 | 102.58 | 129.039 |
| 2/1/12 | 102.574 | 129.405 |
| 2/2/12 | 102.767 | 129.511 |
| 2/3/12 | 102.65 | 129.574 |
| 2/6/12 | 102.774 | 129.798 |
| 2/7/12 | 102.668 | 129.809 |
| 2/8/12 | 102.826 | 130.217 |
| 2/9/12 | 102.679 | 130.377 |
| 2/10/12 | 102.743 | 130.002 |
| 2/13/12 | 102.811 | 130.239 |
| 2/14/12 | 102.821 | 130.083 |
| 2/15/12 | 102.83 | 130.106 |
| 2/16/12 | 102.429 | 129.967 |
| 2/17/12 | 102.479 | 130.307 |
| 2/21/12 | 102.463 | 130.284 |
| 2/22/12 | 102.57 | 130.67 |
| 2/23/12 | 102.664 | 130.956 |
| 2/24/12 | 102.855 | 131.597 |
| 2/27/12 | 103.004 | 131.368 |
| 2/28/12 | 103.144 | 131.529 |
| 2/29/12 | 103.205 | 131.808 |
| 3/1/12 | 103.025 | 131.852 |
| 3/2/12 | 103.284 | 131.736 |
| 3/5/12 | 103.056 | 131.389 |
| 3/6/12 | 102.929 | 130.339 |
| 3/7/12 | 102.889 | 130.576 |
| 3/8/12 | 102.775 | 130.669 |
| 3/9/12 | 102.69 | 131.049 |
| 3/12/12 | 102.756 | 131.049 |
| 3/13/12 | 102.485 | 131.146 |
| 3/14/12 | 102.022 | 131.244 |
| 3/15/12 | 101.978 | 131.069 |
| 3/16/12 | 102.017 | 131.099 |
| 3/19/12 | 101.918 | 130.958 |
| 3/20/12 | 101.786 | 130.727 |
| 3/21/12 | 102.027 | 130.902 |
| 3/22/12 | 101.958 | 130.559 |
| 3/23/12 | 102.123 | 130.411 |
| 3/26/12 | 102.121 | 130.481 |
| 3/27/12 | 102.364 | 130.583 |
| 3/28/12 | 102.343 | 130.551 |
| 3/29/12 | 102.348 | 130.289 |
| 3/30/12 | 102.304 | 130.504 |
| 4/2/12 | 102.275 | 130.507 |
| 4/3/12 | 102.178 | 130.54 |
| 4/4/12 | 101.896 | 130.313 |
| 4/5/12 | 101.959 | 130.066 |
| 4/9/12 | 102.29 | 129.724 |
| 4/10/12 | 102.336 | 129.341 |
| 4/11/12 | 102.227 | 129.316 |
| 4/12/12 | 102.258 | 129.646 |
| 4/13/12 | 102.438 | 129.816 |
| 4/16/12 | 102.512 | 129.715 |
| 4/17/12 | 102.447 | 129.998 |
| 4/18/12 | 102.478 | 130.062 |
| 4/19/12 | 102.542 | 130 |
| 4/20/12 | 102.456 | 130.072 |
| 4/23/12 | 102.528 | 129.844 |
| 4/24/12 | 102.45 | 130.122 |
| 4/25/12 | 102.376 | 130.54 |
| 4/26/12 | 102.526 | 130.61 |
| 4/27/12 | 102.624 | 130.774 |
| 4/30/12 | 102.764 | 131.097 |
| 5/1/12 | 102.747 | 131.422 |
| 5/2/12 | 102.891 | 131.549 |
| 5/3/12 | 102.958 | 131.559 |
| 5/4/12 | 103.036 | 131.564 |
| 5/7/12 | 102.967 | 131.646 |
| 5/8/12 | 103.069 | 131.43 |
| 5/9/12 | 102.922 | 131.22 |
| 5/10/12 | 102.853 | 131.368 |
| 5/11/12 | 102.937 | 131.343 |
| 5/14/12 | 102.896 | 130.719 |
| 5/15/12 | 102.777 | 130.618 |
| 5/16/12 | 102.436 | 130.036 |
| 5/17/12 | 102.22 | 128.787 |
| 5/18/12 | 102.02 | 128.397 |
| 5/21/12 | 101.935 | 127.807 |
| 5/22/12 | 101.836 | 128.404 |
| 5/23/12 | 101.909 | 128.029 |
| 5/24/12 | 101.806 | 128.076 |
| 5/25/12 | 101.934 | 128.245 |
| 5/29/12 | 102 | 128.512 |
| 5/30/12 | 102.241 | 128.252 |
| 5/31/12 | 102.454 | 128.088 |
| 6/1/12 | 102.529 | 127.354 |
| 6/4/12 | 102.342 | 126.898 |
| 6/5/12 | 102.151 | 126.694 |
| 6/6/12 | 102.104 | 127.566 |
| 6/7/12 | 102.302 | 128.314 |
| 6/8/12 | 102.404 | 128.144 |
| 6/11/12 | 102.405 | 128.406 |
| 6/12/12 | 102.158 | 128.202 |
| 6/13/12 | 102.242 | 128.297 |
| 6/14/12 | 102.219 | 128.278 |
| 6/15/12 | 102.624 | 128.671 |
| 6/18/12 | 102.678 | 128.831 |
| 6/19/12 | 102.678 | 129.471 |
| 6/20/12 | 102.731 | 129.982 |
| 6/21/12 | 102.928 | 130.01 |
| 6/22/12 | 102.86 | 129.877 |
| 6/25/12 | 102.926 | 129.569 |
| 6/26/12 | 102.827 | 129.662 |
| 6/27/12 | 102.871 | 129.855 |
| 6/28/12 | 102.95 | 129.949 |
| 6/29/12 | 102.908 | 130.465 |
| 7/2/12 | 103.372 | 130.772 |
| 7/3/12 | 103.438 | 131.071 |
| 7/5/12 | 103.483 | 131.238 |
| 7/6/12 | 103.617 | 131.405 |
| 7/9/12 | 103.743 | 131.298 |
| 7/10/12 | 103.882 | 131.313 |
| 7/11/12 | 103.974 | 131.355 |
| 7/12/12 | 104.078 | 130.988 |
| 7/13/12 | 104.213 | 131.017 |
| 7/16/12 | 104.502 | 130.976 |
| 7/17/12 | 104.542 | 130.994 |
| 7/18/12 | 104.84 | 131.143 |
| 7/19/12 | 104.904 | 131.518 |
| 7/20/12 | 104.869 | 131.357 |
| 7/23/12 | 104.76 | 131.103 |
| 7/24/12 | 104.857 | 130.931 |
| 7/25/12 | 104.856 | 130.805 |
| 7/26/12 | 104.899 | 131.091 |
| 7/27/12 | 104.627 | 131.355 |
| 7/30/12 | 104.84 | 131.604 |
| 7/31/12 | 105.028 | 131.948 |
| 8/1/12 | 104.967 | 132.255 |
| 8/2/12 | 105.058 | 132.124 |
| 8/3/12 | 104.808 | 132.261 |
| 8/6/12 | 105.018 | 132.559 |
| 8/7/12 | 104.746 | 132.745 |
| 8/8/12 | 104.638 | 132.59 |
| 8/9/12 | 104.469 | 132.581 |
| 8/10/12 | 104.646 | 132.362 |
| 8/13/12 | 104.659 | 132.342 |
| 8/14/12 | 104.381 | 132.345 |
| 8/15/12 | 104.02 | 132.073 |
| 8/16/12 | 103.908 | 132.068 |
| 8/17/12 | 103.944 | 132.003 |
| 8/20/12 | 103.998 | 132.164 |
| 8/21/12 | 104.025 | 132.365 |
| 8/22/12 | 104.353 | 132.42 |
| 8/23/12 | 104.574 | 132.471 |
| 8/24/12 | 104.535 | 132.536 |
| 8/27/12 | 104.634 | 132.588 |
| 8/28/12 | 104.679 | 132.662 |
| 8/29/12 | 104.564 | 132.576 |
| 8/30/12 | 104.666 | 132.748 |
| 8/31/12 | 104.854 | 132.757 |
| 9/4/12 | 104.974 | 132.816 |
| 9/5/12 | 104.888 | 132.819 |
| 9/6/12 | 104.737 | 133.125 |
| 9/7/12 | 104.978 | 133.605 |
| 9/10/12 | 104.878 | 133.705 |
| 9/11/12 | 104.922 | 134.088 |
| 9/12/12 | 104.881 | 134.64 |
| 9/13/12 | 104.964 | 134.936 |
| 9/14/12 | 104.926 | 135.468 |
| 9/17/12 | 105.058 | 135.563 |
| 9/18/12 | 105.16 | 135.387 |
| 9/19/12 | 105.306 | 135.375 |
| 9/20/12 | 105.214 | 135.117 |
| 9/21/12 | 105.236 | 135.047 |
| 9/24/12 | 105.353 | 134.578 |
| 9/25/12 | 105.333 | 134.277 |
| 9/26/12 | 105.396 | 133.268 |
| 9/27/12 | 105.535 | 133.642 |
| 9/28/12 | 105.652 | 133.797 |
| 10/1/12 | 105.785 | 133.896 |
| 10/2/12 | 105.876 | 133.835 |
| 10/3/12 | 105.971 | 133.992 |
| 10/4/12 | 106.042 | 134.162 |
| 10/5/12 | 105.919 | 134.321 |
| 10/8/12 | 105.81 | 134.45 |
| 10/9/12 | 105.946 | 134.131 |
| 10/10/12 | 105.923 | 133.801 |
| 10/11/12 | 106.139 | 134.188 |
| 10/12/12 | 106.424 | 134.299 |
| 10/15/12 | 106.445 | 134.521 |
| 10/16/12 | 106.447 | 134.767 |
| 10/17/12 | 106.444 | 135.122 |
| 10/18/12 | 106.326 | 135.204 |
| 10/19/12 | 106.271 | 135.012 |
| 10/22/12 | 106.114 | 134.922 |
| 10/23/12 | 105.996 | 134.365 |
| 10/24/12 | 105.971 | 134.527 |
| 10/25/12 | 105.806 | 134.564 |
| 10/26/12 | 105.938 | 134.21 |
| 10/29/12 | 105.958 | 134.185 |
| 10/30/12 | 105.958 | 134.185 |
| 10/31/12 | 106.102 | 134.104 |
| 11/1/12 | 106.069 | 134.15 |
| 11/2/12 | 106.005 | 134.287 |
| 11/5/12 | 106.032 | 134.281 |
| 11/6/12 | 105.82 | 134.439 |
| 11/7/12 | 105.9 | 133.937 |
| 11/8/12 | 105.923 | 133.875 |
| 11/9/12 | 105.877 | 133.542 |
| 11/12/12 | 105.86 | 133.603 |
| 11/13/12 | 105.873 | 133.044 |
| 11/14/12 | 105.848 | 132.789 |
| 11/15/12 | 105.744 | 132.136 |
| 11/16/12 | 105.693 | 131.979 |
| 11/19/12 | 105.653 | 132.5 |
| 11/20/12 | 105.532 | 132.869 |
| 11/21/12 | 105.358 | 132.945 |
| 11/23/12 | 105.388 | 133.147 |
| 11/26/12 | 105.534 | 133.19 |
| 11/27/12 | 105.586 | 133.501 |
| 11/28/12 | 105.642 | 133.554 |
| 11/29/12 | 105.643 | 133.926 |
| 11/30/12 | 105.715 | 134.285 |
| 12/3/12 | 105.696 | 134.168 |
| 12/4/12 | 105.727 | 134.386 |
| 12/5/12 | 105.874 | 134.874 |
| 12/6/12 | 105.901 | 135.085 |
| 12/7/12 | 105.741 | 135.362 |
| 12/10/12 | 105.722 | 135.452 |
| 12/11/12 | 105.635 | 135.61 |
| 12/12/12 | 105.563 | 135.761 |
| 12/13/12 | 105.422 | 135.826 |
| 12/14/12 | 105.506 | 135.725 |
| 12/17/12 | 105.385 | 135.641 |
| 12/18/12 | 105.191 | 135.742 |
| 12/19/12 | 105.36 | 135.775 |
| 12/20/12 | 105.386 | 135.706 |
| 12/21/12 | 105.493 | 135.434 |
| 12/24/12 | 105.382 | 135.434 |
| 12/26/12 | 105.438 | 135.223 |
| 12/27/12 | 105.63 | 135.36 |
| 12/28/12 | 105.717 | 135.388 |
| 12/31/12 | 105.623 | 135.388 |
| 1/2/13 | 105.494 | 136.004 |
| 1/3/13 | 105.419 | 136.223 |
| 1/4/13 | 105.349 | 136.418 |
| 1/7/13 | 105.428 | 136.539 |
| 1/8/13 | 105.485 | 136.567 |
| 1/9/13 | 105.45 | 136.666 |
| 1/10/13 | 105.382 | 136.791 |
| 1/11/13 | 105.347 | 136.887 |
| 1/14/13 | 105.372 | 136.76 |
| 1/15/13 | 105.348 | 136.538 |
| 1/16/13 | 105.332 | 136.64 |
| 1/17/13 | 105.127 | 136.744 |
| 1/18/13 | 105.195 | 136.872 |
| 1/22/13 | 105.239 | 136.901 |
| 1/23/13 | 105.259 | 137.065 |
| 1/24/13 | 105.154 | 137.18 |
| 1/25/13 | 104.918 | 137.344 |
| 1/28/13 | 104.671 | 137.292 |
| 1/29/13 | 104.628 | 136.915 |
| 1/30/13 | 104.462 | 136.633 |
| 1/31/13 | 104.489 | 136.183 |
| 2/1/13 | 104.509 | 136.3 |
| 2/4/13 | 104.516 | 135.996 |
| 2/5/13 | 104.38 | 135.778 |
| 2/6/13 | 104.452 | 135.607 |
| 2/7/13 | 104.557 | 135.447 |
| 2/8/13 | 104.482 | 135.313 |
| 2/11/13 | 104.548 | 135.322 |
| 2/12/13 | 104.435 | 135.393 |
| 2/13/13 | 104.331 | 135.446 |
| 2/14/13 | 104.432 | 135.524 |
| 2/15/13 | 104.394 | 135.504 |
| 2/19/13 | 104.387 | 135.572 |
| 2/20/13 | 104.348 | 135.627 |
| 2/21/13 | 104.499 | 135.402 |
| 2/22/13 | 104.557 | 135.485 |
| 2/25/13 | 104.756 | 135.664 |
| 2/26/13 | 104.841 | 135.55 |
| 2/27/13 | 104.778 | 135.597 |
| 2/28/13 | 104.777 | 135.799 |
| 3/1/13 | 104.858 | 135.684 |
| 3/4/13 | 104.85 | 135.753 |
| 3/5/13 | 104.754 | 136.111 |
| 3/6/13 | 104.599 | 136.122 |
| 3/7/13 | 104.412 | 136.133 |
| 3/8/13 | 104.18 | 136.117 |
| 3/11/13 | 104.184 | 136.2 |
| 3/12/13 | 104.331 | 136.304 |
| 3/13/13 | 104.278 | 136.283 |
| 3/14/13 | 104.276 | 136.504 |
| 3/15/13 | 104.401 | 136.543 |
| 3/18/13 | 104.535 | 136.549 |
| 3/19/13 | 104.67 | 136.561 |
| 3/20/13 | 104.466 | 136.574 |
| 3/21/13 | 104.428 | 136.487 |
| 3/22/13 | 104.404 | 136.502 |
| 3/25/13 | 104.386 | 136.448 |
| 3/26/13 | 104.316 | 136.408 |
| 3/27/13 | 104.488 | 136.442 |
| 3/28/13 | 104.489 | 136.483 |
| 4/1/13 | 104.516 | 136.479 |
| 4/2/13 | 104.463 | 136.55 |
| 4/3/13 | 104.642 | 136.537 |
| 4/4/13 | 104.92 | 136.53 |
| 4/5/13 | 105.293 | 136.496 |
| 4/8/13 | 105.29 | 136.464 |
| 4/9/13 | 105.304 | 136.717 |
| 4/10/13 | 105.125 | 136.822 |
| 4/11/13 | 105.12 | 137.05 |
| 4/12/13 | 105.316 | 137.192 |
| 4/15/13 | 105.424 | 137.038 |
| 4/16/13 | 105.369 | 137.111 |
| 4/17/13 | 105.389 | 136.936 |
| 4/18/13 | 105.407 | 136.862 |
| 4/19/13 | 105.346 | 136.955 |
| 4/22/13 | 105.406 | 137.056 |
| 4/23/13 | 105.46 | 137.317 |
| 4/24/13 | 105.498 | 137.459 |
| 4/25/13 | 105.38 | 137.639 |
| 4/26/13 | 105.595 | 137.856 |
| 4/29/13 | 105.615 | 138.038 |
| 4/30/13 | 105.612 | 138.388 |
| 5/1/13 | 105.781 | 138.733 |
| 5/2/13 | 105.844 | 138.955 |
| 5/3/13 | 105.494 | 139.201 |
| 5/6/13 | 105.353 | 139.261 |
| 5/7/13 | 105.329 | 139.46 |
| 5/8/13 | 105.359 | 139.652 |
| 5/9/13 | 105.342 | 139.604 |
| 5/10/13 | 104.923 | 139.359 |
| 5/13/13 | 104.727 | 138.947 |
| 5/14/13 | 104.694 | 138.789 |
| 5/15/13 | 104.673 | 138.724 |
| 5/16/13 | 104.927 | 138.831 |
| 5/17/13 | 104.738 | 138.852 |
| 5/20/13 | 104.621 | 138.896 |
| 5/21/13 | 104.661 | 138.85 |
| 5/22/13 | 104.462 | 138.759 |
| 5/23/13 | 104.301 | 138.269 |
| 5/24/13 | 104.298 | 138.075 |
| 5/28/13 | 103.825 | 137.844 |
| 5/29/13 | 103.525 | 137.043 |
| 5/30/13 | 103.475 | 136.973 |
| 5/31/13 | 103.159 | 136.601 |
| 6/3/13 | 103.169 | 135.944 |
| 6/4/13 | 102.987 | 135.582 |
| 6/5/13 | 102.781 | 134.538 |
| 6/6/13 | 102.788 | 134.224 |
| 6/7/13 | 102.678 | 135.191 |
| 6/10/13 | 102.314 | 134.939 |
| 6/11/13 | 101.98 | 133.85 |
| 6/12/13 | 102.018 | 134.087 |
| 6/13/13 | 102.11 | 133.805 |
| 6/14/13 | 102.545 | 134.401 |
| 6/17/13 | 102.474 | 134.746 |
| 6/18/13 | 102.164 | 134.589 |
| 6/19/13 | 101.914 | 134.457 |
| 6/20/13 | 100.588 | 132.485 |
| 6/21/13 | 100.219 | 132.116 |
| 6/24/13 | 99.311 | 130.267 |
| 6/25/13 | 99.469 | 130.422 |
| 6/26/13 | 99.857 | 131.058 |
| 6/27/13 | 100.266 | 131.995 |
| 6/28/13 | 100.357 | 132.199 |
| 7/1/13 | 100.575 | 132.38 |
| 7/2/13 | 100.774 | 132.5 |
| 7/3/13 | 100.789 | 132.233 |
| 7/5/13 | 100.052 | 132.062 |
| 7/8/13 | 100.063 | 131.702 |
| 7/9/13 | 100.261 | 131.99 |
| 7/10/13 | 100.23 | 132.194 |
| 7/11/13 | 100.65 | 133.132 |
| 7/12/13 | 100.778 | 133.422 |
| 7/15/13 | 100.866 | 133.956 |
| 7/16/13 | 101.036 | 134.184 |
| 7/17/13 | 101.286 | 134.476 |
| 7/18/13 | 101.274 | 135.077 |
| 7/19/13 | 101.435 | 135.209 |
| 7/22/13 | 101.6 | 135.45 |
| 7/23/13 | 101.546 | 135.437 |
| 7/24/13 | 101.125 | 134.763 |
| 7/25/13 | 100.927 | 134.065 |
| 7/26/13 | 101.109 | 134.013 |
| 7/29/13 | 101.003 | 133.854 |
| 7/30/13 | 100.974 | 133.888 |
| 7/31/13 | 100.761 | 133.596 |
| 8/1/13 | 100.577 | 133.583 |
| 8/2/13 | 100.839 | 133.403 |
| 8/5/13 | 100.724 | 133.206 |
| 8/6/13 | 100.666 | 132.905 |
| 8/7/13 | 100.771 | 132.644 |
| 8/8/13 | 100.906 | 132.743 |
| 8/9/13 | 100.882 | 132.811 |
| 8/12/13 | 100.814 | 132.845 |
| 8/13/13 | 100.327 | 132.628 |
| 8/14/13 | 100.232 | 132.676 |
| 8/15/13 | 99.756 | 132.339 |
| 8/16/13 | 99.565 | 132.204 |
| 8/19/13 | 99.254 | 131.767 |
| 8/20/13 | 99.406 | 131.634 |
| 8/21/13 | 99.234 | 131.571 |
| 8/22/13 | 99.051 | 131.404 |
| 8/23/13 | 99.367 | 131.617 |
| 8/26/13 | 99.636 | 131.681 |
| 8/27/13 | 99.89 | 131.589 |
| 8/28/13 | 99.751 | 131.599 |
| 8/29/13 | 99.819 | 131.721 |
| 8/30/13 | 99.969 | 131.931 |
| 9/3/13 | 99.443 | 131.767 |
| 9/4/13 | 99.4 | 131.735 |
| 9/5/13 | 98.833 | 131.503 |
| 9/6/13 | 99.036 | 131.534 |
| 9/9/13 | 99.126 | 131.762 |
| 9/10/13 | 98.881 | 131.688 |
| 9/11/13 | 98.985 | 131.774 |
| 9/12/13 | 99.199 | 132.012 |
| 9/13/13 | 99.132 | 132.108 |
| 9/16/13 | 99.445 | 132.49 |
| 9/17/13 | 99.387 | 132.526 |
| 9/18/13 | 99.587 | 132.801 |
| 9/19/13 | 100.13 | 133.454 |
| 9/20/13 | 100.145 | 133.463 |
| 9/23/13 | 100.222 | 133.158 |
| 9/24/13 | 100.458 | 133.178 |
| 9/25/13 | 100.57 | 133.037 |
| 9/26/13 | 100.459 | 132.947 |
| 9/27/13 | 100.477 | 132.761 |
| 9/30/13 | 100.36 | 132.403 |
| 10/1/13 | 100.351 | 132.559 |
| 10/2/13 | 100.5 | 132.65 |
| 10/3/13 | 100.614 | 132.895 |
| 10/4/13 | 100.436 | 132.974 |
| 10/7/13 | 100.499 | 133.004 |
| 10/8/13 | 100.458 | 132.84 |
| 10/9/13 | 100.359 | 132.765 |
| 10/10/13 | 100.309 | 133.012 |
| 10/11/13 | 100.536 | 133.183 |
| 10/14/13 | 100.578 | 133.263 |
| 10/15/13 | 100.404 | 133.285 |
| 10/16/13 | 100.541 | 133.539 |
| 10/17/13 | 101.066 | 134.085 |
| 10/18/13 | 101.3 | 134.484 |
| 10/21/13 | 101.202 | 134.622 |
| 10/22/13 | 101.507 | 134.843 |
| 10/23/13 | 101.575 | 134.752 |
| 10/24/13 | 101.454 | 134.8 |
| 10/25/13 | 101.475 | 134.836 |
| 10/28/13 | 101.432 | 134.984 |
| 10/29/13 | 101.425 | 134.988 |
| 10/30/13 | 101.524 | 135.037 |
| 10/31/13 | 101.352 | 135.022 |
| 11/1/13 | 101.143 | 134.905 |
| 11/4/13 | 101.125 | 135.008 |
| 11/5/13 | 100.846 | 134.753 |
| 11/6/13 | 100.906 | 134.761 |
| 11/7/13 | 100.99 | 134.746 |
| 11/8/13 | 100.473 | 134.373 |
| 11/11/13 | 100.506 | 134.437 |
| 11/12/13 | 100.257 | 134.002 |
| 11/13/13 | 100.423 | 133.829 |
| 11/14/13 | 100.717 | 134.11 |
| 11/15/13 | 100.772 | 134.271 |
| 11/18/13 | 101.031 | 134.561 |
| 11/19/13 | 100.928 | 134.495 |
| 11/20/13 | 100.749 | 134.418 |
| 11/21/13 | 100.578 | 134.251 |
| 11/22/13 | 100.784 | 134.462 |
| 11/25/13 | 100.926 | 134.532 |
| 11/26/13 | 101.066 | 134.489 |
| 11/27/13 | 100.968 | 134.694 |
| 11/29/13 | 100.926 | 134.769 |
| 12/2/13 | 100.715 | 134.59 |
| 12/3/13 | 100.783 | 134.592 |
| 12/4/13 | 100.522 | 134.448 |
| 12/5/13 | 100.422 | 134.378 |
| 12/6/13 | 100.434 | 134.486 |
| 12/9/13 | 100.55 | 134.531 |
| 12/10/13 | 100.804 | 134.606 |
| 12/11/13 | 100.783 | 134.549 |
| 12/12/13 | 100.616 | 134.316 |
| 12/13/13 | 100.656 | 134.34 |
| 12/16/13 | 100.77 | 134.355 |
| 12/17/13 | 100.883 | 134.318 |
| 12/18/13 | 100.862 | 134.256 |
| 12/19/13 | 100.784 | 134.28 |
| 12/20/13 | 100.91 | 134.382 |
| 12/23/13 | 100.94 | 134.459 |
| 12/24/13 | 100.826 | 134.433 |
| 12/26/13 | 100.715 | 134.462 |
| 12/27/13 | 100.661 | 134.544 |
| 12/30/13 | 100.78 | 134.644 |
| 12/31/13 | 100.835 | 134.665 |